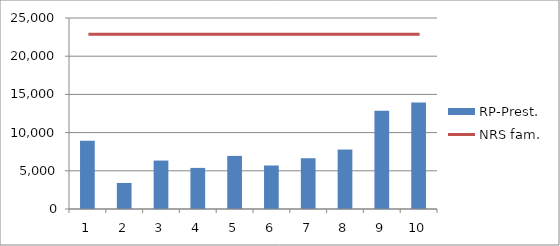
| Category | RP-Prest. |
|---|---|
| 0 | 8925.756 |
| 1 | 3409.829 |
| 2 | 6341.167 |
| 3 | 5379.763 |
| 4 | 6950.96 |
| 5 | 5693.183 |
| 6 | 6642.563 |
| 7 | 7781.335 |
| 8 | 12874.394 |
| 9 | 13947.291 |